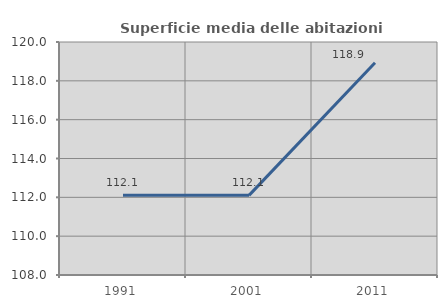
| Category | Superficie media delle abitazioni occupate |
|---|---|
| 1991.0 | 112.102 |
| 2001.0 | 112.101 |
| 2011.0 | 118.931 |